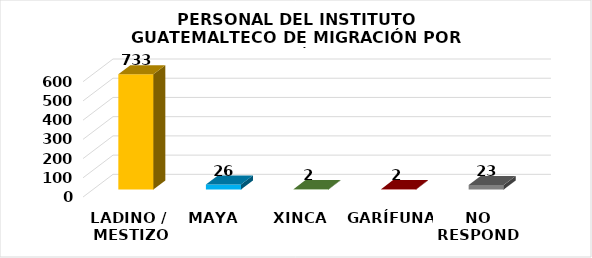
| Category | Series 0 |
|---|---|
| LADINO /
 MESTIZO | 733 |
| MAYA | 26 |
| XINCA | 2 |
| GARÍFUNA | 2 |
| NO RESPONDE | 23 |